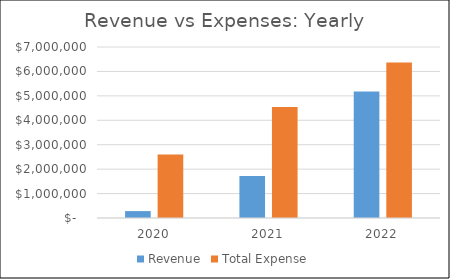
| Category | Revenue | Total Expense |
|---|---|---|
| 2020.0 | 283333.333 | 2595949.375 |
| 2021.0 | 1716666.667 | 4539016.106 |
| 2022.0 | 5175000 | 6361758.619 |